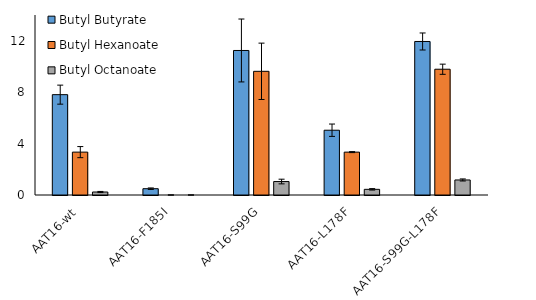
| Category | Butyl Butyrate | Butyl Hexanoate | Butyl Octanoate |
|---|---|---|---|
| AAT16-wt | 7.805 | 3.336 | 0.233 |
| AAT16-F185I | 0.491 | 0 | 0 |
| AAT16-S99G | 11.241 | 9.62 | 1.047 |
| AAT16-L178F | 5.038 | 3.335 | 0.44 |
| AAT16-S99G-L178F | 11.94 | 9.782 | 1.17 |